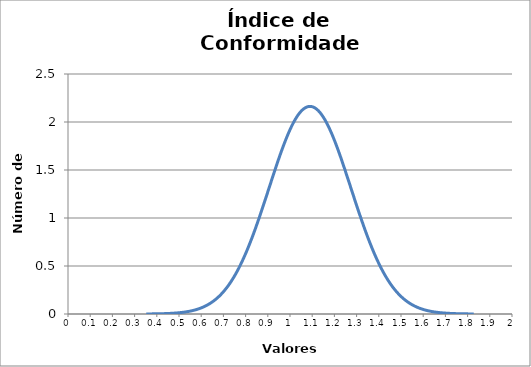
| Category | Series 0 |
|---|---|
| 0.35208652097892024 | 0.001 |
| 0.3669938639894471 | 0.001 |
| 0.381901206999974 | 0.001 |
| 0.39680855001050086 | 0.002 |
| 0.41171589302102773 | 0.003 |
| 0.4266232360315546 | 0.003 |
| 0.4415305790420815 | 0.004 |
| 0.45643792205260836 | 0.006 |
| 0.47134526506313523 | 0.008 |
| 0.4862526080736621 | 0.01 |
| 0.501159951084189 | 0.013 |
| 0.5160672940947159 | 0.017 |
| 0.5309746371052427 | 0.022 |
| 0.5458819801157696 | 0.028 |
| 0.5607893231262965 | 0.035 |
| 0.5756966661368234 | 0.044 |
| 0.5906040091473502 | 0.055 |
| 0.6055113521578771 | 0.069 |
| 0.620418695168404 | 0.085 |
| 0.6353260381789309 | 0.104 |
| 0.6502333811894577 | 0.126 |
| 0.6651407241999846 | 0.152 |
| 0.6800480672105115 | 0.183 |
| 0.6949554102210383 | 0.218 |
| 0.7098627532315652 | 0.259 |
| 0.7247700962420921 | 0.305 |
| 0.739677439252619 | 0.356 |
| 0.7545847822631458 | 0.414 |
| 0.7694921252736727 | 0.478 |
| 0.7843994682841996 | 0.548 |
| 0.7993068112947265 | 0.625 |
| 0.8142141543052533 | 0.707 |
| 0.8291214973157802 | 0.796 |
| 0.8440288403263071 | 0.889 |
| 0.858936183336834 | 0.987 |
| 0.8738435263473608 | 1.089 |
| 0.8887508693578877 | 1.193 |
| 0.9036582123684146 | 1.298 |
| 0.9185655553789415 | 1.404 |
| 0.9334728983894683 | 1.509 |
| 0.9483802413999952 | 1.611 |
| 0.9632875844105221 | 1.708 |
| 0.978194927421049 | 1.8 |
| 0.9931022704315758 | 1.884 |
| 1.0080096134421026 | 1.959 |
| 1.0229169564526295 | 2.024 |
| 1.0378242994631564 | 2.078 |
| 1.0527316424736832 | 2.119 |
| 1.06763898548421 | 2.147 |
| 1.082546328494737 | 2.161 |
| 1.0974536715052639 | 2.161 |
| 1.1123610145157907 | 2.147 |
| 1.1272683575263176 | 2.119 |
| 1.1421757005368445 | 2.078 |
| 1.1570830435473713 | 2.024 |
| 1.1719903865578982 | 1.959 |
| 1.186897729568425 | 1.884 |
| 1.201805072578952 | 1.8 |
| 1.2167124155894788 | 1.708 |
| 1.2316197586000057 | 1.611 |
| 1.2465271016105326 | 1.509 |
| 1.2614344446210595 | 1.404 |
| 1.2763417876315863 | 1.298 |
| 1.2912491306421132 | 1.193 |
| 1.30615647365264 | 1.089 |
| 1.321063816663167 | 0.987 |
| 1.3359711596736938 | 0.889 |
| 1.3508785026842207 | 0.796 |
| 1.3657858456947476 | 0.707 |
| 1.3806931887052745 | 0.625 |
| 1.3956005317158013 | 0.548 |
| 1.4105078747263282 | 0.478 |
| 1.425415217736855 | 0.414 |
| 1.440322560747382 | 0.356 |
| 1.4552299037579088 | 0.305 |
| 1.4701372467684357 | 0.259 |
| 1.4850445897789626 | 0.218 |
| 1.4999519327894895 | 0.183 |
| 1.5148592758000163 | 0.152 |
| 1.5297666188105432 | 0.126 |
| 1.54467396182107 | 0.104 |
| 1.559581304831597 | 0.085 |
| 1.5744886478421238 | 0.069 |
| 1.5893959908526507 | 0.055 |
| 1.6043033338631776 | 0.044 |
| 1.6192106768737045 | 0.035 |
| 1.6341180198842313 | 0.028 |
| 1.6490253628947582 | 0.022 |
| 1.663932705905285 | 0.017 |
| 1.678840048915812 | 0.013 |
| 1.6937473919263388 | 0.01 |
| 1.7086547349368657 | 0.008 |
| 1.7235620779473926 | 0.006 |
| 1.7384694209579195 | 0.004 |
| 1.7533767639684463 | 0.003 |
| 1.7682841069789732 | 0.003 |
| 1.7831914499895 | 0.002 |
| 1.798098793000027 | 0.001 |
| 1.8130061360105538 | 0.001 |
| 1.8279134790210807 | 0.001 |